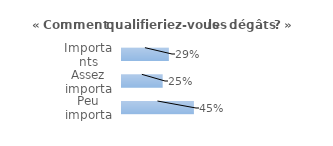
| Category | Series 0 |
|---|---|
| Importants | 0.293 |
| Assez importants | 0.254 |
| Peu importants | 0.449 |